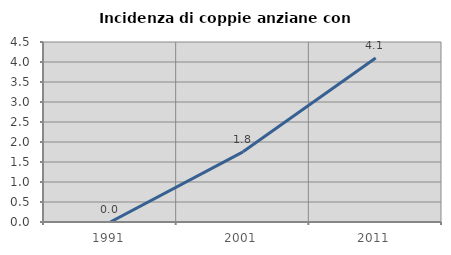
| Category | Incidenza di coppie anziane con figli |
|---|---|
| 1991.0 | 0 |
| 2001.0 | 1.754 |
| 2011.0 | 4.098 |